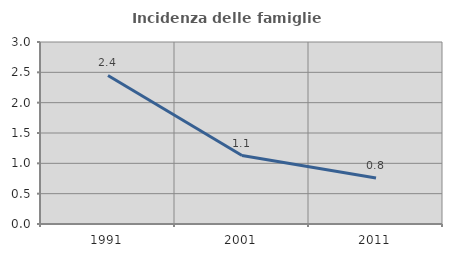
| Category | Incidenza delle famiglie numerose |
|---|---|
| 1991.0 | 2.449 |
| 2001.0 | 1.128 |
| 2011.0 | 0.758 |